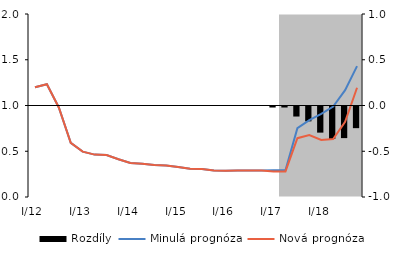
| Category | Rozdíly |
|---|---|
| 0 | 0 |
| 1 | 0 |
| 2 | 0 |
| 3 | 0 |
| 4 | 0 |
| 5 | 0 |
| 6 | 0 |
| 7 | 0 |
| 8 | 0 |
| 9 | 0 |
| 10 | 0 |
| 11 | 0 |
| 12 | 0 |
| 13 | 0 |
| 14 | 0 |
| 15 | 0 |
| 16 | 0 |
| 17 | 0 |
| 18 | 0 |
| 19 | 0 |
| 20 | -0.011 |
| 21 | -0.011 |
| 22 | -0.11 |
| 23 | -0.162 |
| 24 | -0.286 |
| 25 | -0.355 |
| 26 | -0.345 |
| 27 | -0.237 |